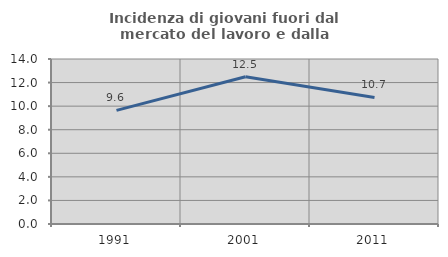
| Category | Incidenza di giovani fuori dal mercato del lavoro e dalla formazione  |
|---|---|
| 1991.0 | 9.644 |
| 2001.0 | 12.492 |
| 2011.0 | 10.739 |